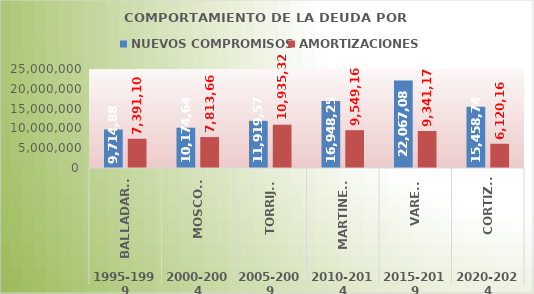
| Category | NUEVOS COMPROMISOS | AMORTIZACIONES |
|---|---|---|
| 0 | 9714881 | 7391108 |
| 1 | 10174646 | 7813666 |
| 2 | 11919574 | 10935323 |
| 3 | 16948250.309 | 9549160.637 |
| 4 | 22067087.738 | 9341175.502 |
| 5 | 15458740.47 | 6120162.771 |